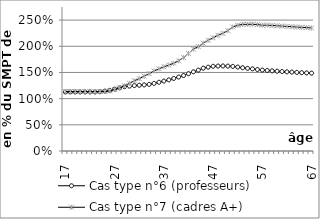
| Category | Cas type n°6 (professeurs) | Cas type n°7 (cadres A+) |
|---|---|---|
| 17.0 | 1.128 | 1.136 |
| 18.0 | 1.128 | 1.136 |
| 19.0 | 1.128 | 1.136 |
| 20.0 | 1.128 | 1.136 |
| 21.0 | 1.128 | 1.136 |
| 22.0 | 1.128 | 1.136 |
| 23.0 | 1.128 | 1.136 |
| 24.0 | 1.132 | 1.136 |
| 25.0 | 1.143 | 1.136 |
| 26.0 | 1.158 | 1.147 |
| 27.0 | 1.181 | 1.173 |
| 28.0 | 1.206 | 1.206 |
| 29.0 | 1.227 | 1.245 |
| 30.0 | 1.239 | 1.292 |
| 31.0 | 1.25 | 1.341 |
| 32.0 | 1.256 | 1.383 |
| 33.0 | 1.262 | 1.428 |
| 34.0 | 1.272 | 1.478 |
| 35.0 | 1.291 | 1.527 |
| 36.0 | 1.313 | 1.569 |
| 37.0 | 1.336 | 1.609 |
| 38.0 | 1.359 | 1.641 |
| 39.0 | 1.386 | 1.676 |
| 40.0 | 1.413 | 1.722 |
| 41.0 | 1.441 | 1.784 |
| 42.0 | 1.476 | 1.862 |
| 43.0 | 1.513 | 1.948 |
| 44.0 | 1.544 | 1.994 |
| 45.0 | 1.582 | 2.059 |
| 46.0 | 1.601 | 2.114 |
| 47.0 | 1.618 | 2.163 |
| 48.0 | 1.622 | 2.21 |
| 49.0 | 1.624 | 2.249 |
| 50.0 | 1.621 | 2.298 |
| 51.0 | 1.616 | 2.368 |
| 52.0 | 1.603 | 2.4 |
| 53.0 | 1.59 | 2.418 |
| 54.0 | 1.578 | 2.419 |
| 55.0 | 1.568 | 2.422 |
| 56.0 | 1.556 | 2.413 |
| 57.0 | 1.546 | 2.402 |
| 58.0 | 1.538 | 2.404 |
| 59.0 | 1.531 | 2.397 |
| 60.0 | 1.524 | 2.391 |
| 61.0 | 1.518 | 2.385 |
| 62.0 | 1.512 | 2.379 |
| 63.0 | 1.507 | 2.374 |
| 64.0 | 1.501 | 2.368 |
| 65.0 | 1.496 | 2.362 |
| 66.0 | 1.492 | 2.356 |
| 67.0 | 1.487 | 2.35 |